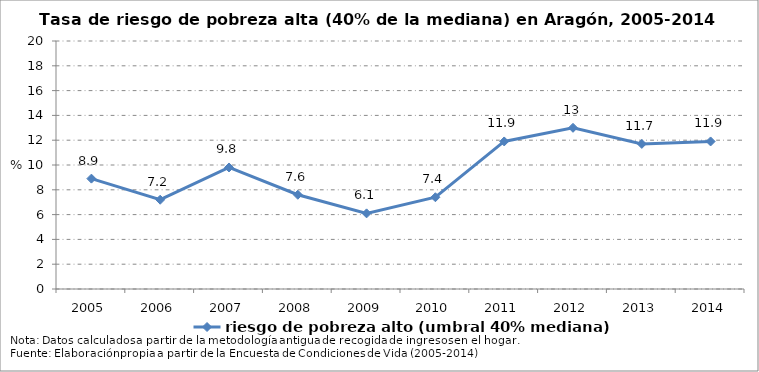
| Category | riesgo de pobreza alto (umbral 40% mediana) |
|---|---|
| 2005.0 | 8.9 |
| 2006.0 | 7.2 |
| 2007.0 | 9.8 |
| 2008.0 | 7.6 |
| 2009.0 | 6.1 |
| 2010.0 | 7.4 |
| 2011.0 | 11.9 |
| 2012.0 | 13 |
| 2013.0 | 11.7 |
| 2014.0 | 11.9 |